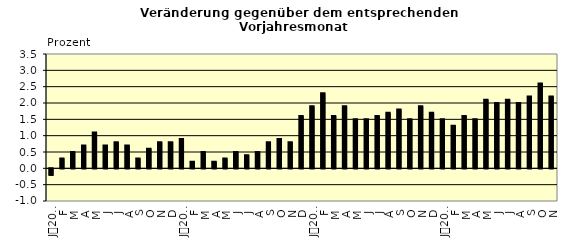
| Category | Series 0 |
|---|---|
| 0 | -0.2 |
| 1 | 0.3 |
| 2 | 0.5 |
| 3 | 0.7 |
| 4 | 1.1 |
| 5 | 0.7 |
| 6 | 0.8 |
| 7 | 0.7 |
| 8 | 0.3 |
| 9 | 0.6 |
| 10 | 0.8 |
| 11 | 0.8 |
| 12 | 0.9 |
| 13 | 0.2 |
| 14 | 0.5 |
| 15 | 0.2 |
| 16 | 0.3 |
| 17 | 0.5 |
| 18 | 0.4 |
| 19 | 0.5 |
| 20 | 0.8 |
| 21 | 0.9 |
| 22 | 0.8 |
| 23 | 1.6 |
| 24 | 1.9 |
| 25 | 2.3 |
| 26 | 1.6 |
| 27 | 1.9 |
| 28 | 1.5 |
| 29 | 1.5 |
| 30 | 1.6 |
| 31 | 1.7 |
| 32 | 1.8 |
| 33 | 1.5 |
| 34 | 1.9 |
| 35 | 1.7 |
| 36 | 1.5 |
| 37 | 1.3 |
| 38 | 1.6 |
| 39 | 1.5 |
| 40 | 2.1 |
| 41 | 2 |
| 42 | 2.1 |
| 43 | 2 |
| 44 | 2.2 |
| 45 | 2.6 |
| 46 | 2.2 |